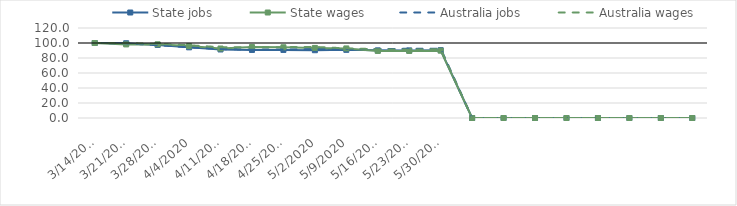
| Category | State jobs | State wages | Australia jobs | Australia wages |
|---|---|---|---|---|
| 14/03/2020 | 100 | 100 | 100 | 100 |
| 21/03/2020 | 99.654 | 98.116 | 99.552 | 99.902 |
| 28/03/2020 | 97.368 | 98.274 | 97.088 | 98.771 |
| 04/04/2020 | 94.218 | 95.868 | 94.15 | 97.007 |
| 11/04/2020 | 91.356 | 92.641 | 91.933 | 94.434 |
| 18/04/2020 | 90.745 | 94.603 | 91.108 | 94.115 |
| 25/04/2020 | 90.764 | 94.311 | 91.306 | 94.452 |
| 02/05/2020 | 90.362 | 93.422 | 91.63 | 94.778 |
| 09/05/2020 | 90.88 | 92.76 | 91.91 | 92.892 |
| 16/05/2020 | 90.204 | 89.397 | 92.165 | 91.712 |
| 23/05/2020 | 90.14 | 89.409 | 92.167 | 91.106 |
| 30/05/2020 | 90.451 | 89.798 | 92.546 | 91.708 |